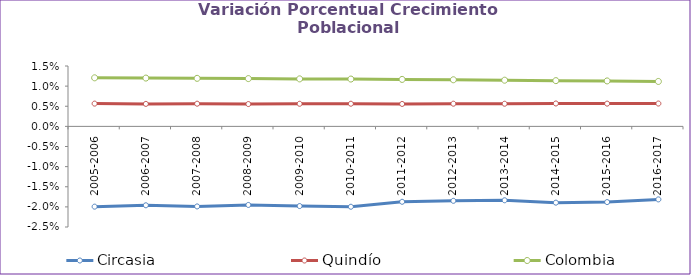
| Category | Circasia | Quindío | Colombia |
|---|---|---|---|
| 2005-2006 | -0.02 | 0.006 | 0.012 |
| 2006-2007 | -0.02 | 0.006 | 0.012 |
| 2007-2008 | -0.02 | 0.006 | 0.012 |
| 2008-2009 | -0.02 | 0.006 | 0.012 |
| 2009-2010 | -0.02 | 0.006 | 0.012 |
| 2010-2011 | -0.02 | 0.006 | 0.012 |
| 2011-2012 | -0.019 | 0.006 | 0.012 |
| 2012-2013 | -0.018 | 0.006 | 0.012 |
| 2013-2014 | -0.018 | 0.006 | 0.011 |
| 2014-2015 | -0.019 | 0.006 | 0.011 |
| 2015-2016 | -0.019 | 0.006 | 0.011 |
| 2016-2017 | -0.018 | 0.006 | 0.011 |